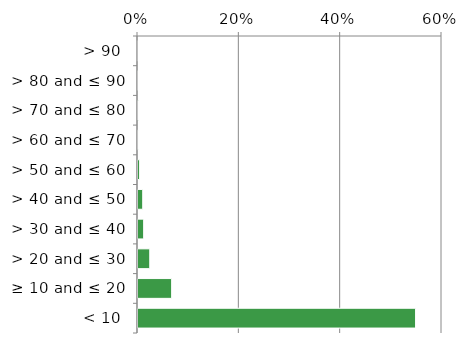
| Category | Native |
|---|---|
| < 10 | 0.55 |
| ≥ 10 and ≤ 20 | 0.068 |
| > 20 and ≤ 30 | 0.025 |
| > 30 and ≤ 40 | 0.013 |
| > 40 and ≤ 50 | 0.011 |
| > 50 and ≤ 60 | 0.005 |
| > 60 and ≤ 70 | 0.003 |
| > 70 and ≤ 80 | 0.003 |
| > 80 and ≤ 90 | 0.001 |
| > 90 | 0 |